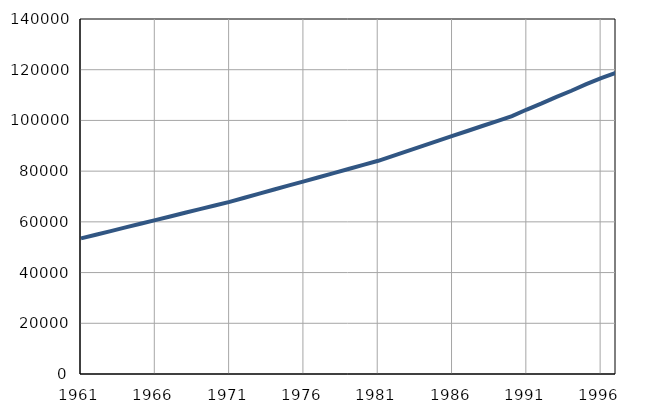
| Category | Број
становника |
|---|---|
| 1961.0 | 53476 |
| 1962.0 | 54918 |
| 1963.0 | 56360 |
| 1964.0 | 57802 |
| 1965.0 | 59244 |
| 1966.0 | 60686 |
| 1967.0 | 62128 |
| 1968.0 | 63570 |
| 1969.0 | 65012 |
| 1970.0 | 66454 |
| 1971.0 | 67893 |
| 1972.0 | 69512 |
| 1973.0 | 71131 |
| 1974.0 | 72750 |
| 1975.0 | 74369 |
| 1976.0 | 75988 |
| 1977.0 | 77607 |
| 1978.0 | 79226 |
| 1979.0 | 80845 |
| 1980.0 | 82464 |
| 1981.0 | 84085 |
| 1982.0 | 86044 |
| 1983.0 | 88003 |
| 1984.0 | 89962 |
| 1985.0 | 91921 |
| 1986.0 | 93880 |
| 1987.0 | 95839 |
| 1988.0 | 97798 |
| 1989.0 | 99757 |
| 1990.0 | 101716 |
| 1991.0 | 104300 |
| 1992.0 | 106700 |
| 1993.0 | 109300 |
| 1994.0 | 111700 |
| 1995.0 | 114300 |
| 1996.0 | 116700 |
| 1997.0 | 118800 |